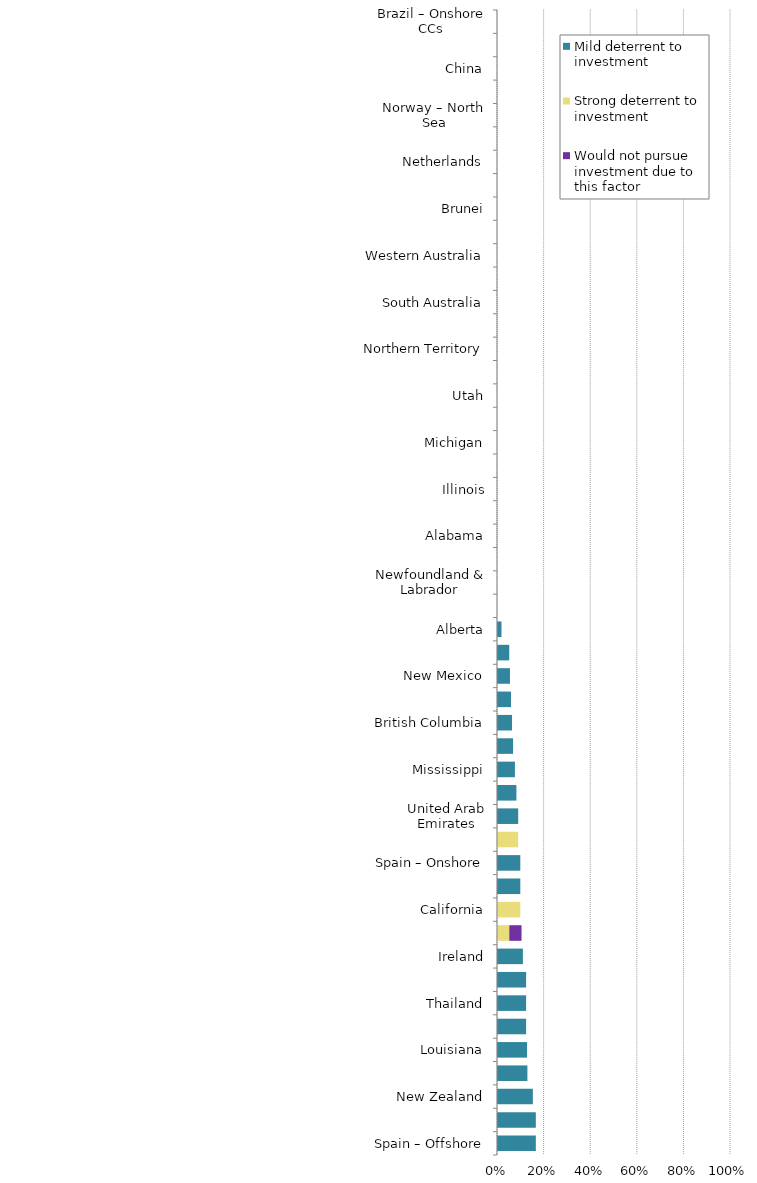
| Category | Mild deterrent to investment | Strong deterrent to investment | Would not pursue investment due to this factor |
|---|---|---|---|
| Spain – Offshore | 0.167 | 0 | 0 |
| Suriname | 0.167 | 0 | 0 |
| New Zealand | 0.154 | 0 | 0 |
| Colorado | 0.13 | 0 | 0 |
| Louisiana | 0.129 | 0 | 0 |
| Montana | 0.125 | 0 | 0 |
| Thailand | 0.125 | 0 | 0 |
| Namibia | 0.125 | 0 | 0 |
| Ireland | 0.111 | 0 | 0 |
| US Offshore – Gulf of Mexico | 0 | 0.053 | 0.053 |
| California | 0 | 0.1 | 0 |
| Ohio | 0.1 | 0 | 0 |
| Spain – Onshore | 0.1 | 0 | 0 |
| New South Wales | 0 | 0.091 | 0 |
| United Arab Emirates | 0.091 | 0 | 0 |
| North Dakota | 0.083 | 0 | 0 |
| Mississippi | 0.077 | 0 | 0 |
| Oklahoma | 0.069 | 0 | 0 |
| British Columbia | 0.065 | 0 | 0 |
| Texas | 0.06 | 0 | 0 |
| New Mexico | 0.056 | 0 | 0 |
| Wyoming | 0.053 | 0 | 0 |
| Alberta | 0.019 | 0 | 0 |
| Manitoba | 0 | 0 | 0 |
| Newfoundland & Labrador | 0 | 0 | 0 |
| Saskatchewan | 0 | 0 | 0 |
| Alabama | 0 | 0 | 0 |
| Arkansas | 0 | 0 | 0 |
| Illinois | 0 | 0 | 0 |
| Kansas | 0 | 0 | 0 |
| Michigan | 0 | 0 | 0 |
| Pennsylvania | 0 | 0 | 0 |
| Utah | 0 | 0 | 0 |
| West Virginia | 0 | 0 | 0 |
| Northern Territory | 0 | 0 | 0 |
| Queensland | 0 | 0 | 0 |
| South Australia | 0 | 0 | 0 |
| Victoria | 0 | 0 | 0 |
| Western Australia | 0 | 0 | 0 |
| Australia – Offshore | 0 | 0 | 0 |
| Brunei | 0 | 0 | 0 |
| Hungary | 0 | 0 | 0 |
| Netherlands | 0 | 0 | 0 |
| Norway – Other Offshore (ex. Nth. Sea) | 0 | 0 | 0 |
| Norway – North Sea | 0 | 0 | 0 |
| United Kingdom – North Sea | 0 | 0 | 0 |
| China | 0 | 0 | 0 |
| Oman | 0 | 0 | 0 |
| Brazil – Onshore CCs | 0 | 0 | 0 |